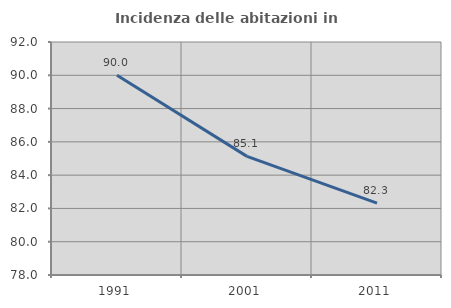
| Category | Incidenza delle abitazioni in proprietà  |
|---|---|
| 1991.0 | 90 |
| 2001.0 | 85.128 |
| 2011.0 | 82.32 |